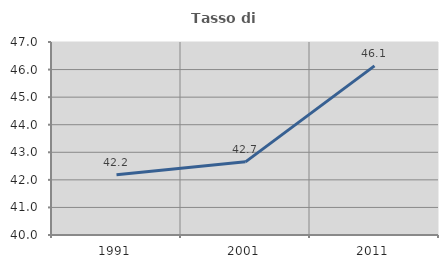
| Category | Tasso di occupazione   |
|---|---|
| 1991.0 | 42.188 |
| 2001.0 | 42.654 |
| 2011.0 | 46.136 |